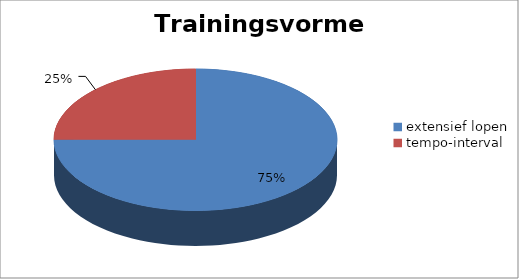
| Category | Series 0 |
|---|---|
| extensief lopen | 30 |
| tempo-interval | 10 |